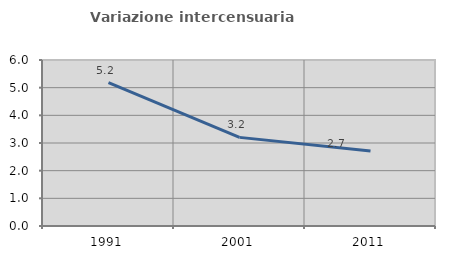
| Category | Variazione intercensuaria annua |
|---|---|
| 1991.0 | 5.186 |
| 2001.0 | 3.203 |
| 2011.0 | 2.714 |